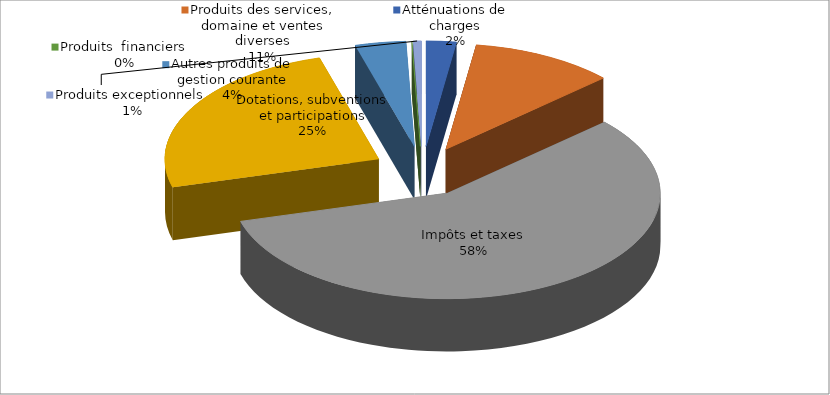
| Category | Series 0 |
|---|---|
| Atténuations de charges | 109109.26 |
| Produits des services, domaine et ventes diverses | 523772.17 |
| Impôts et taxes | 2760070.92 |
| Dotations, subventions et participations | 1191682.24 |
| Autres produits de gestion courante | 184203.68 |
| Produits  financiers | 15.51 |
| Produits exceptionnels  | 30508.09 |